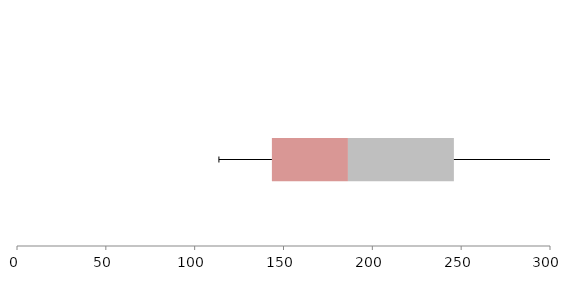
| Category | Series 1 | Series 2 | Series 3 |
|---|---|---|---|
| 0 | 143.468 | 42.799 | 59.635 |